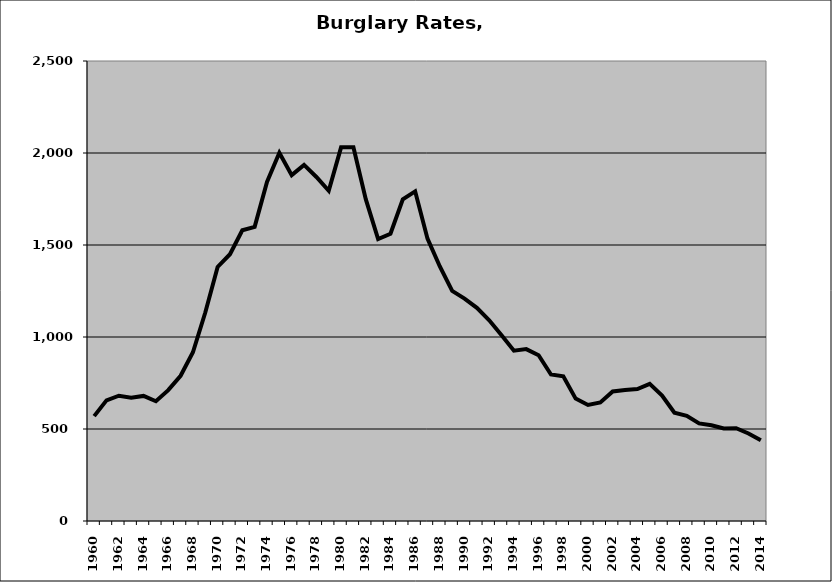
| Category | Burglary |
|---|---|
| 1960.0 | 569.915 |
| 1961.0 | 655.867 |
| 1962.0 | 681.07 |
| 1963.0 | 670.525 |
| 1964.0 | 679.908 |
| 1965.0 | 650.94 |
| 1966.0 | 711.027 |
| 1967.0 | 789.367 |
| 1968.0 | 916.992 |
| 1969.0 | 1133.238 |
| 1970.0 | 1380.944 |
| 1971.0 | 1450.022 |
| 1972.0 | 1580.059 |
| 1973.0 | 1598.81 |
| 1974.0 | 1843.149 |
| 1975.0 | 2001.184 |
| 1976.0 | 1879.907 |
| 1977.0 | 1935.242 |
| 1978.0 | 1869.551 |
| 1979.0 | 1794.408 |
| 1980.0 | 2030.811 |
| 1981.0 | 2031.623 |
| 1982.0 | 1749.097 |
| 1983.0 | 1532.367 |
| 1984.0 | 1561.328 |
| 1985.0 | 1748.066 |
| 1986.0 | 1791.582 |
| 1987.0 | 1534.587 |
| 1988.0 | 1383.07 |
| 1989.0 | 1250.377 |
| 1990.0 | 1208.781 |
| 1991.0 | 1158.336 |
| 1992.0 | 1090.865 |
| 1993.0 | 1009.843 |
| 1994.0 | 925.684 |
| 1995.0 | 934.107 |
| 1996.0 | 900.759 |
| 1997.0 | 796.147 |
| 1998.0 | 786.477 |
| 1999.0 | 665.141 |
| 2000.0 | 630.815 |
| 2001.0 | 643.942 |
| 2002.0 | 703.791 |
| 2003.0 | 712.327 |
| 2004.0 | 717.325 |
| 2005.0 | 745.095 |
| 2006.0 | 681.999 |
| 2007.0 | 588.541 |
| 2008.0 | 571.85 |
| 2009.0 | 530.116 |
| 2010.0 | 520.023 |
| 2011.0 | 502.805 |
| 2012.0 | 504.157 |
| 2013.0 | 475.618 |
| 2014.0 | 438.248 |